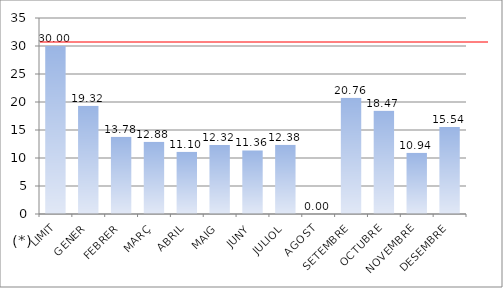
| Category | Series 0 |
|---|---|
| LIMIT | 30 |
| GENER | 19.32 |
| FEBRER | 13.78 |
| MARÇ | 12.88 |
| ABRIL | 11.1 |
| MAIG | 12.32 |
| JUNY | 11.36 |
| JULIOL | 12.38 |
| AGOST | 0 |
| SETEMBRE | 20.76 |
| OCTUBRE | 18.47 |
| NOVEMBRE | 10.94 |
| DESEMBRE | 15.54 |